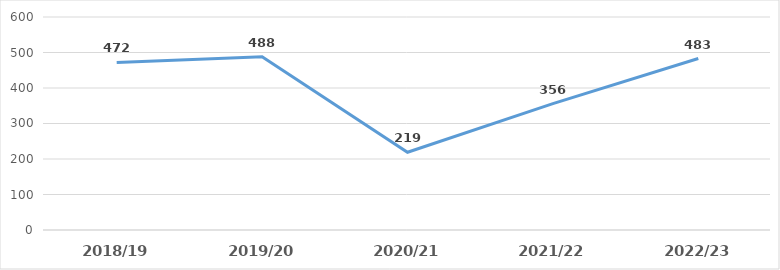
| Category | Series 0 |
|---|---|
| 2018/19 | 472 |
| 2019/20 | 488 |
| 2020/21 | 219 |
| 2021/22 | 356 |
| 2022/23 | 483 |